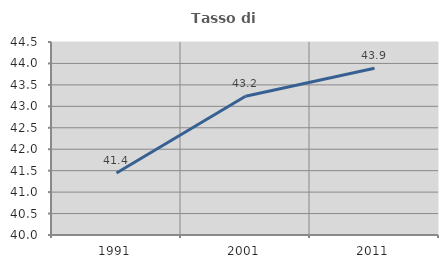
| Category | Tasso di occupazione   |
|---|---|
| 1991.0 | 41.444 |
| 2001.0 | 43.234 |
| 2011.0 | 43.89 |